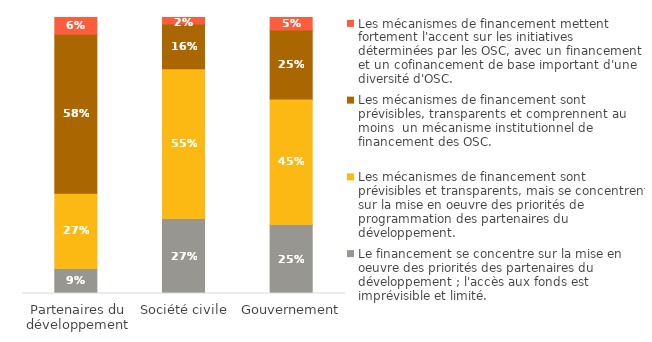
| Category | Le financement se concentre sur la mise en oeuvre des priorités des partenaires du développement ; l'accès aux fonds est imprévisible et limité. | Les mécanismes de financement sont prévisibles et transparents, mais se concentrent sur la mise en oeuvre des priorités de programmation des partenaires du développement. | Les mécanismes de financement sont prévisibles, transparents et comprennent au moins  un mécanisme institutionnel de financement des OSC. | Les mécanismes de financement mettent fortement l'accent sur les initiatives déterminées par les OSC, avec un financement et un cofinancement de base important d'une diversité d'OSC. |
|---|---|---|---|---|
| Gouvernement | 0.25 | 0.455 | 0.25 | 0.045 |
| Société civile | 0.273 | 0.545 | 0.163 | 0.023 |
| Partenaires du développement | 0.091 | 0.273 | 0.576 | 0.061 |